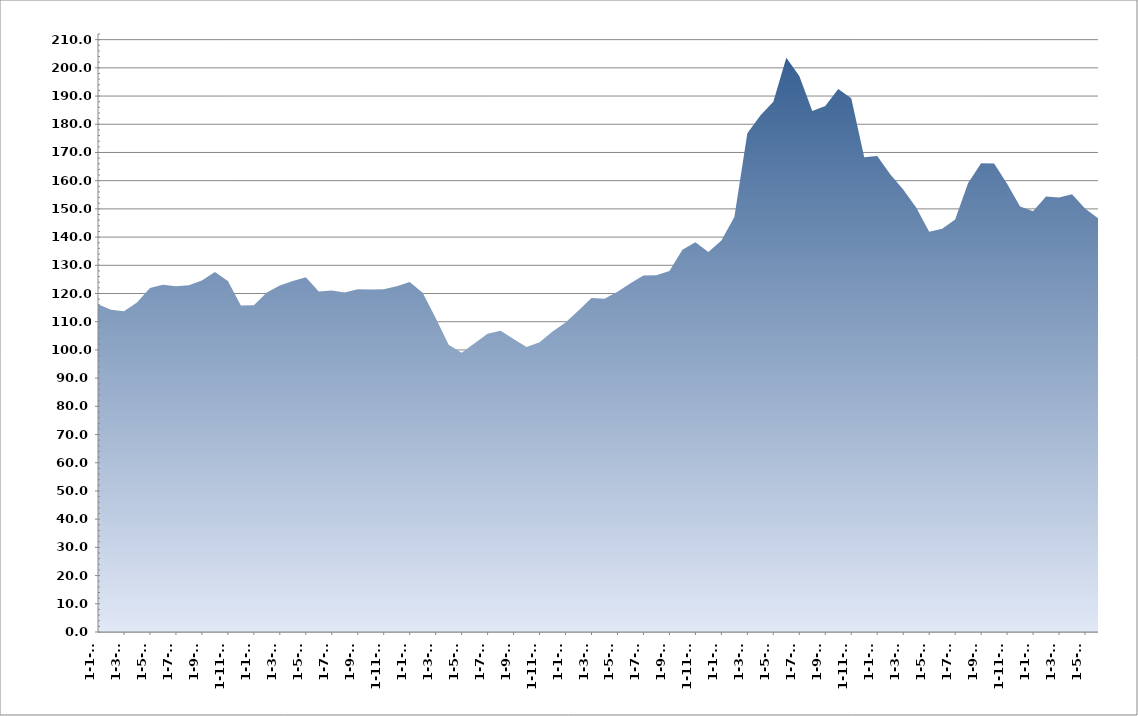
| Category | Series 0 |
|---|---|
| 2018-01-01 | 116.18 |
| 2018-02-01 | 114.28 |
| 2018-03-01 | 113.7 |
| 2018-04-01 | 116.79 |
| 2018-05-01 | 121.91 |
| 2018-06-01 | 123.1 |
| 2018-07-01 | 122.53 |
| 2018-08-01 | 122.91 |
| 2018-09-01 | 124.64 |
| 2018-10-01 | 127.64 |
| 2018-11-01 | 124.42 |
| 2018-12-01 | 115.71 |
| 2019-01-01 | 115.81 |
| 2019-02-01 | 120.36 |
| 2019-03-01 | 122.85 |
| 2019-04-01 | 124.47 |
| 2019-05-01 | 125.78 |
| 2019-06-01 | 120.74 |
| 2019-07-01 | 121.04 |
| 2019-08-01 | 120.4 |
| 2019-09-01 | 121.51 |
| 2019-10-01 | 121.45 |
| 2019-11-01 | 121.54 |
| 2019-12-01 | 122.6 |
| 2020-01-01 | 124.09 |
| 2020-02-01 | 120.27 |
| 2020-03-01 | 111.28 |
| 2020-04-01 | 101.83 |
| 2020-05-01 | 98.97 |
| 2020-06-01 | 102.37 |
| 2020-07-01 | 105.77 |
| 2020-08-01 | 106.77 |
| 2020-09-01 | 103.91 |
| 2020-10-01 | 101.05 |
| 2020-11-01 | 102.76 |
| 2020-12-01 | 106.49 |
| 2021-01-01 | 109.69 |
| 2021-02-01 | 114 |
| 2021-03-01 | 118.38 |
| 2021-04-01 | 118.18 |
| 2021-05-01 | 120.61 |
| 2021-06-01 | 123.6 |
| 2021-07-01 | 126.37 |
| 2021-08-01 | 126.45 |
| 2021-09-01 | 128.01 |
| 2021-10-01 | 135.51 |
| 2021-11-01 | 138.13 |
| 2021-12-01 | 134.69 |
| 2022-01-01 | 138.76 |
| 2022-02-01 | 147.08 |
| 2022-03-01 | 176.82 |
| 2022-04-01 | 183.08 |
| 2022-05-01 | 188 |
| 2022-06-01 | 203.62 |
| 2022-07-01 | 197.14 |
| 2022-08-01 | 184.67 |
| 2022-09-01 | 186.5 |
| 2022-10-01 | 192.52 |
| 2022-11-01 | 189.26 |
| 2022-12-01 | 168.31 |
| 2023-01-01 | 168.77 |
| 2023-02-01 | 162.26 |
| 2023-03-01 | 156.89 |
| 2023-04-01 | 150.52 |
| 2023-05-01 | 141.89 |
| 2023-06-01 | 142.95 |
| 2023-07-01 | 146.23 |
| 2023-08-01 | 159.16 |
| 2023-09-01 | 166.14 |
| 2023-10-01 | 166.12 |
| 2023-11-01 | 158.95 |
| 2023-12-01 | 150.88 |
| 2024-01-01 | 149.16 |
| 2024-02-01 | 154.39 |
| 2024-03-01 | 154.05 |
| 2024-04-01 | 155.22 |
| 2024-05-01 | 150.1 |
| 2024-06-01 | 146.71 |